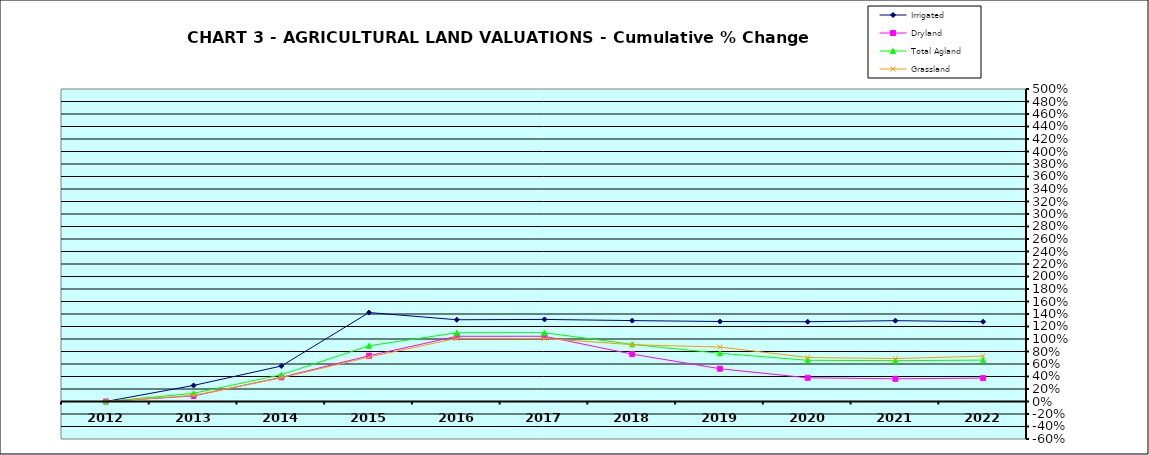
| Category | Irrigated | Dryland | Total Agland | Grassland |
|---|---|---|---|---|
| 2012.0 | 0 | 0 | 0 | 0 |
| 2013.0 | 0.257 | 0.089 | 0.131 | 0.097 |
| 2014.0 | 0.567 | 0.387 | 0.428 | 0.378 |
| 2015.0 | 1.423 | 0.732 | 0.892 | 0.71 |
| 2016.0 | 1.308 | 1.043 | 1.099 | 1.011 |
| 2017.0 | 1.313 | 1.044 | 1.1 | 1.007 |
| 2018.0 | 1.294 | 0.758 | 0.914 | 0.909 |
| 2019.0 | 1.28 | 0.524 | 0.771 | 0.871 |
| 2020.0 | 1.276 | 0.379 | 0.66 | 0.704 |
| 2021.0 | 1.293 | 0.363 | 0.653 | 0.686 |
| 2022.0 | 1.276 | 0.374 | 0.663 | 0.727 |